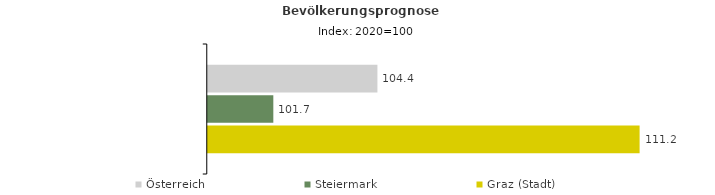
| Category | Österreich | Steiermark | Graz (Stadt) |
|---|---|---|---|
| 2020.0 | 104.4 | 101.7 | 111.2 |